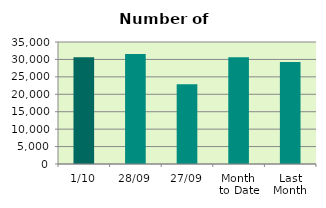
| Category | Series 0 |
|---|---|
| 1/10 | 30658 |
| 28/09 | 31584 |
| 27/09 | 22898 |
| Month 
to Date | 30658 |
| Last
Month | 29250.6 |